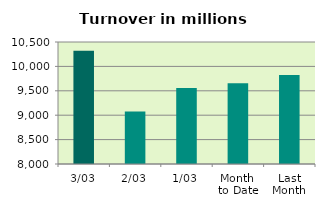
| Category | Series 0 |
|---|---|
| 3/03 | 10323.109 |
| 2/03 | 9077.154 |
| 1/03 | 9558.199 |
| Month 
to Date | 9652.821 |
| Last
Month | 9824.278 |